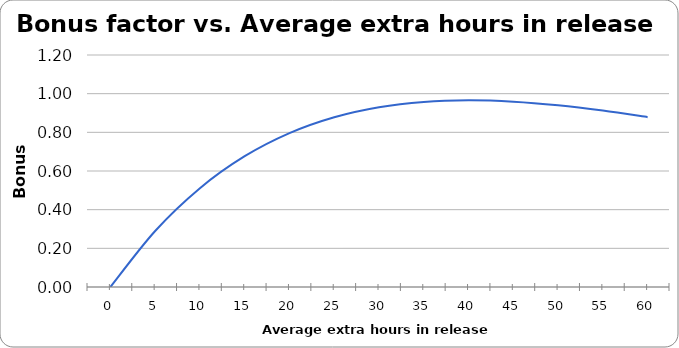
| Category | Series 0 |
|---|---|
| 0.0 | 0 |
| 5.0 | 0.29 |
| 10.0 | 0.511 |
| 15.0 | 0.677 |
| 20.0 | 0.796 |
| 25.0 | 0.878 |
| 30.0 | 0.93 |
| 35.0 | 0.957 |
| 40.0 | 0.966 |
| 45.0 | 0.959 |
| 50.0 | 0.94 |
| 55.0 | 0.913 |
| 60.0 | 0.879 |